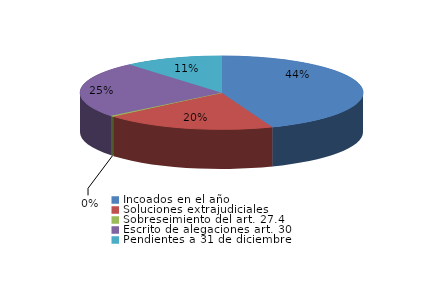
| Category | Series 0 |
|---|---|
| Incoados en el año | 663 |
| Soluciones extrajudiciales | 294 |
| Sobreseimiento del art. 27.4 | 7 |
| Escrito de alegaciones art. 30 | 369 |
| Pendientes a 31 de diciembre | 168 |